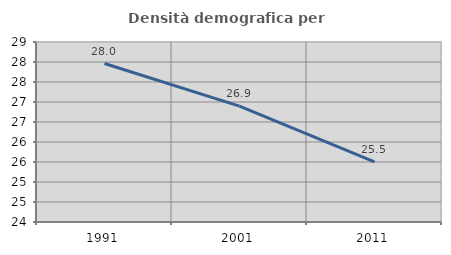
| Category | Densità demografica |
|---|---|
| 1991.0 | 27.962 |
| 2001.0 | 26.896 |
| 2011.0 | 25.503 |